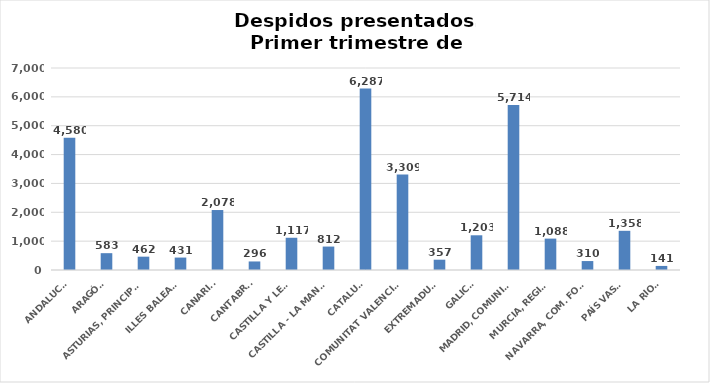
| Category | Series 0 |
|---|---|
| ANDALUCÍA | 4580 |
| ARAGÓN | 583 |
| ASTURIAS, PRINCIPADO | 462 |
| ILLES BALEARS | 431 |
| CANARIAS | 2078 |
| CANTABRIA | 296 |
| CASTILLA Y LEÓN | 1117 |
| CASTILLA - LA MANCHA | 812 |
| CATALUÑA | 6287 |
| COMUNITAT VALENCIANA | 3309 |
| EXTREMADURA | 357 |
| GALICIA | 1203 |
| MADRID, COMUNIDAD | 5714 |
| MURCIA, REGIÓN | 1088 |
| NAVARRA, COM. FORAL | 310 |
| PAÍS VASCO | 1358 |
| LA RIOJA | 141 |